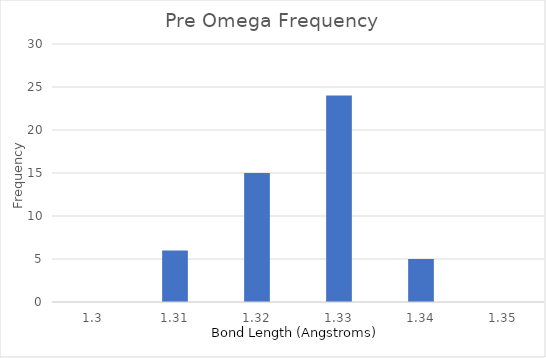
| Category | Pre Omega |
|---|---|
| 1.3 | 0 |
| 1.31 | 6 |
| 1.32 | 15 |
| 1.33 | 24 |
| 1.34 | 5 |
| 1.35 | 0 |